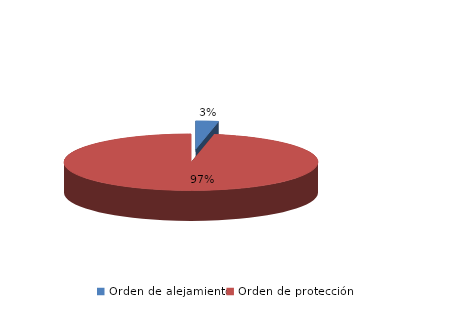
| Category | Series 0 |
|---|---|
| Orden de alejamiento | 3 |
| Orden de protección | 101 |